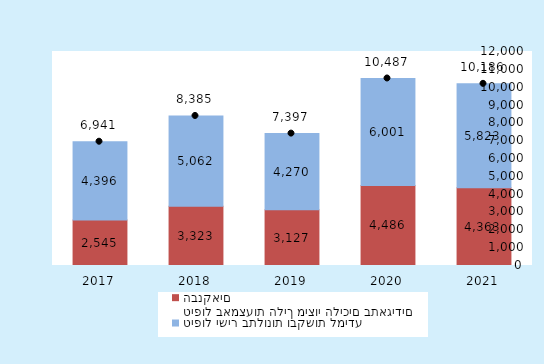
| Category | טיפול באמצעות הליך מיצוי הליכים בתאגידים הבנקאים | טיפול ישיר בתלונות ובקשות למידע |
|---|---|---|
| 2021.0 | 4363 | 5823 |
| 2020.0 | 4486 | 6001 |
| 2019.0 | 3127 | 4270 |
| 2018.0 | 3323 | 5062 |
| 2017.0 | 2545 | 4396 |